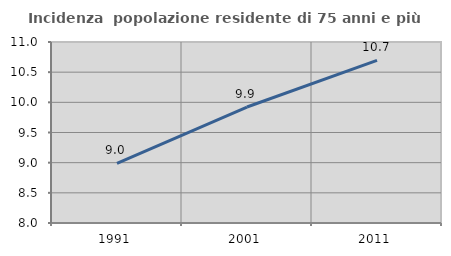
| Category | Incidenza  popolazione residente di 75 anni e più |
|---|---|
| 1991.0 | 8.99 |
| 2001.0 | 9.922 |
| 2011.0 | 10.694 |